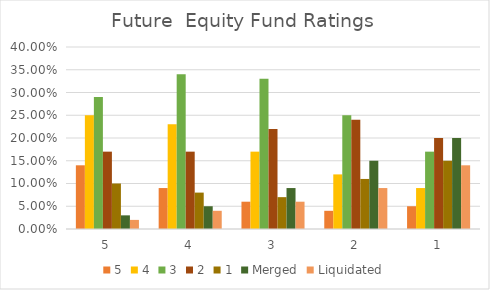
| Category | 5 | 4 | 3 | 2 | 1 | Merged | Liquidated |
|---|---|---|---|---|---|---|---|
| 5.0 | 0.14 | 0.25 | 0.29 | 0.17 | 0.1 | 0.03 | 0.02 |
| 4.0 | 0.09 | 0.23 | 0.34 | 0.17 | 0.08 | 0.05 | 0.04 |
| 3.0 | 0.06 | 0.17 | 0.33 | 0.22 | 0.07 | 0.09 | 0.06 |
| 2.0 | 0.04 | 0.12 | 0.25 | 0.24 | 0.11 | 0.15 | 0.09 |
| 1.0 | 0.05 | 0.09 | 0.17 | 0.2 | 0.15 | 0.2 | 0.14 |